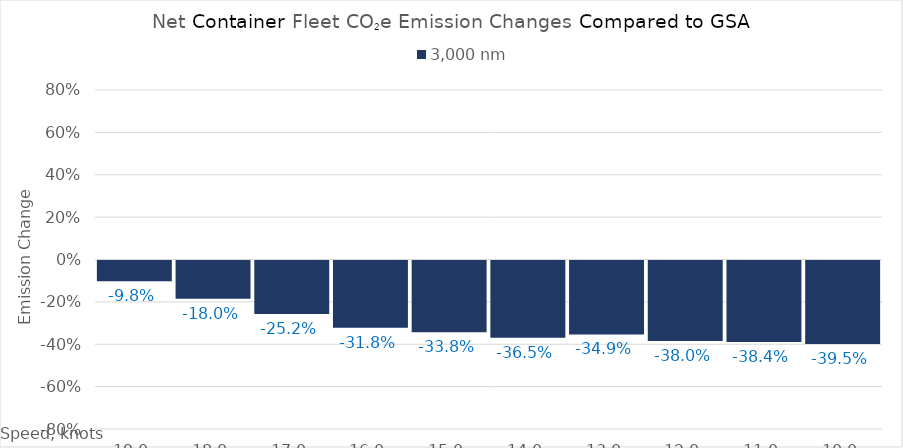
| Category | 3,000 |
|---|---|
| 19.0 | -0.098 |
| 18.0 | -0.18 |
| 17.0 | -0.252 |
| 16.0 | -0.318 |
| 15.0 | -0.338 |
| 14.0 | -0.365 |
| 13.0 | -0.349 |
| 12.0 | -0.38 |
| 11.0 | -0.384 |
| 10.0 | -0.395 |